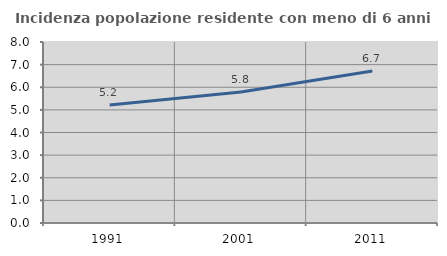
| Category | Incidenza popolazione residente con meno di 6 anni |
|---|---|
| 1991.0 | 5.215 |
| 2001.0 | 5.793 |
| 2011.0 | 6.716 |